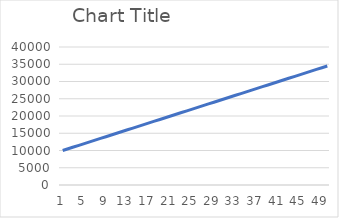
| Category | Series 0 |
|---|---|
| 0 | 10000 |
| 1 | 10500 |
| 2 | 11000 |
| 3 | 11500 |
| 4 | 12000 |
| 5 | 12500 |
| 6 | 13000 |
| 7 | 13500 |
| 8 | 14000 |
| 9 | 14500 |
| 10 | 15000 |
| 11 | 15500 |
| 12 | 16000 |
| 13 | 16500 |
| 14 | 17000 |
| 15 | 17500 |
| 16 | 18000 |
| 17 | 18500 |
| 18 | 19000 |
| 19 | 19500 |
| 20 | 20000 |
| 21 | 20500 |
| 22 | 21000 |
| 23 | 21500 |
| 24 | 22000 |
| 25 | 22500 |
| 26 | 23000 |
| 27 | 23500 |
| 28 | 24000 |
| 29 | 24500 |
| 30 | 25000 |
| 31 | 25500 |
| 32 | 26000 |
| 33 | 26500 |
| 34 | 27000 |
| 35 | 27500 |
| 36 | 28000 |
| 37 | 28500 |
| 38 | 29000 |
| 39 | 29500 |
| 40 | 30000 |
| 41 | 30500 |
| 42 | 31000 |
| 43 | 31500 |
| 44 | 32000 |
| 45 | 32500 |
| 46 | 33000 |
| 47 | 33500 |
| 48 | 34000 |
| 49 | 34500 |